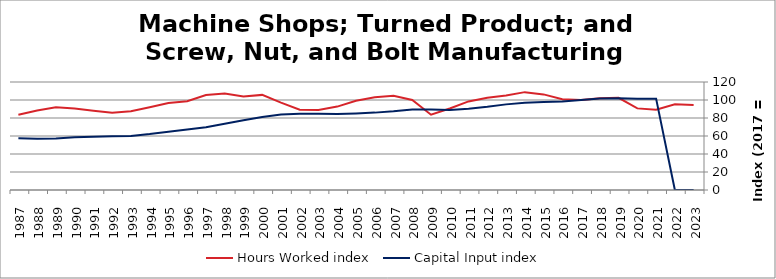
| Category | Hours Worked index | Capital Input index |
|---|---|---|
| 2023.0 | 94.534 | 0 |
| 2022.0 | 95.268 | 0 |
| 2021.0 | 89.177 | 101.477 |
| 2020.0 | 90.675 | 101.432 |
| 2019.0 | 102.376 | 101.84 |
| 2018.0 | 101.971 | 101.696 |
| 2017.0 | 100 | 100 |
| 2016.0 | 100.811 | 98.459 |
| 2015.0 | 106.231 | 97.887 |
| 2014.0 | 108.733 | 96.834 |
| 2013.0 | 104.898 | 95.142 |
| 2012.0 | 102.477 | 92.504 |
| 2011.0 | 98.407 | 90.356 |
| 2010.0 | 90.528 | 88.869 |
| 2009.0 | 83.667 | 89.507 |
| 2008.0 | 100.018 | 89.48 |
| 2007.0 | 104.655 | 87.494 |
| 2006.0 | 103.142 | 85.974 |
| 2005.0 | 99.18 | 85.127 |
| 2004.0 | 92.679 | 84.308 |
| 2003.0 | 88.847 | 84.598 |
| 2002.0 | 89.159 | 84.589 |
| 2001.0 | 97.093 | 83.828 |
| 2000.0 | 105.679 | 81.08 |
| 1999.0 | 103.967 | 77.594 |
| 1998.0 | 107.132 | 73.541 |
| 1997.0 | 105.533 | 69.721 |
| 1996.0 | 98.654 | 67.161 |
| 1995.0 | 96.591 | 64.771 |
| 1994.0 | 92.024 | 62.144 |
| 1993.0 | 87.551 | 60.128 |
| 1992.0 | 85.745 | 59.603 |
| 1991.0 | 88.074 | 59.079 |
| 1990.0 | 90.6 | 58.521 |
| 1989.0 | 91.937 | 57.202 |
| 1988.0 | 88.284 | 56.973 |
| 1987.0 | 83.609 | 57.458 |